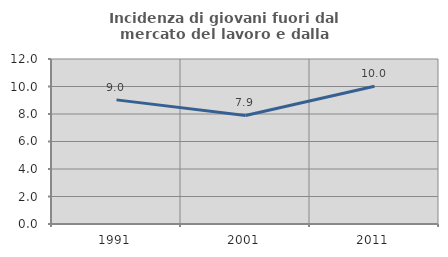
| Category | Incidenza di giovani fuori dal mercato del lavoro e dalla formazione  |
|---|---|
| 1991.0 | 9.027 |
| 2001.0 | 7.895 |
| 2011.0 | 10.023 |